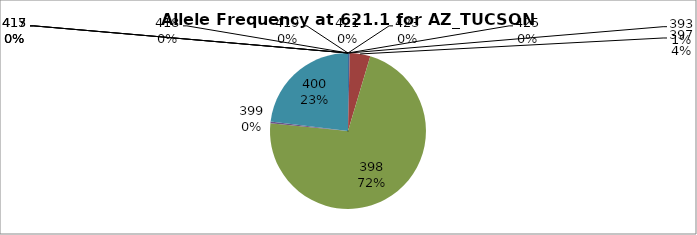
| Category | Series 0 |
|---|---|
| 393.0 | 0.004 |
| 397.0 | 0.043 |
| 398.0 | 0.72 |
| 399.0 | 0.004 |
| 400.0 | 0.23 |
| 413.0 | 0 |
| 415.0 | 0 |
| 417.0 | 0 |
| 418.0 | 0 |
| 419.0 | 0 |
| 421.0 | 0 |
| 423.0 | 0 |
| 425.0 | 0 |